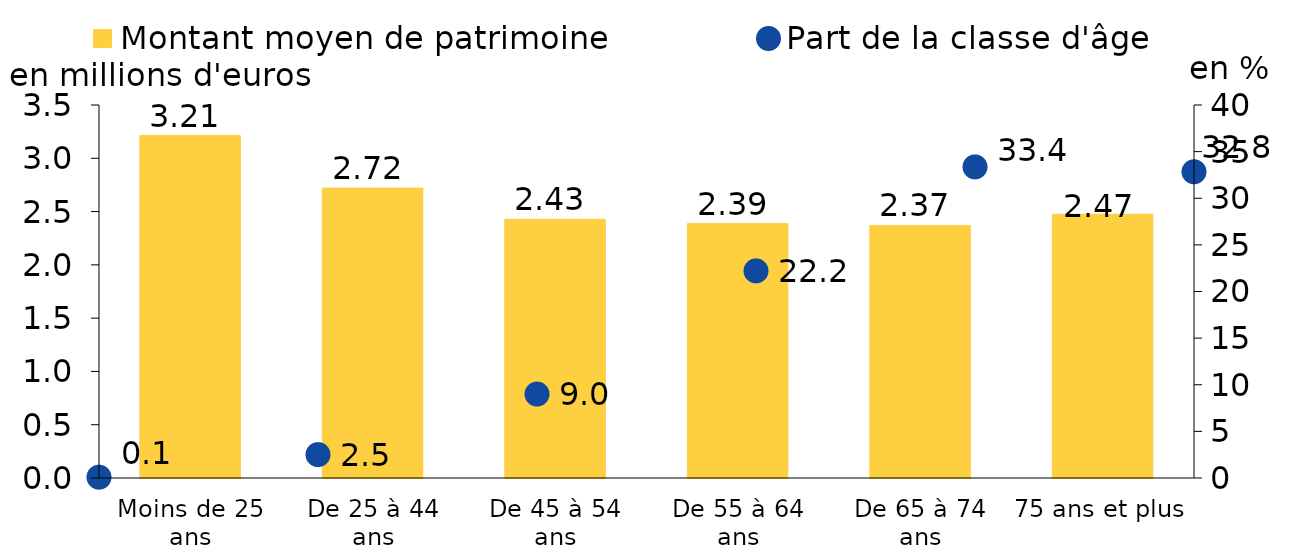
| Category | Montant moyen de patrimoine |
|---|---|
| Moins de 25 ans | 3.213 |
| De 25 à 44 ans | 2.721 |
| De 45 à 54 ans | 2.428 |
| De 55 à 64 ans | 2.387 |
| De 65 à 74 ans | 2.369 |
| 75 ans et plus | 2.475 |